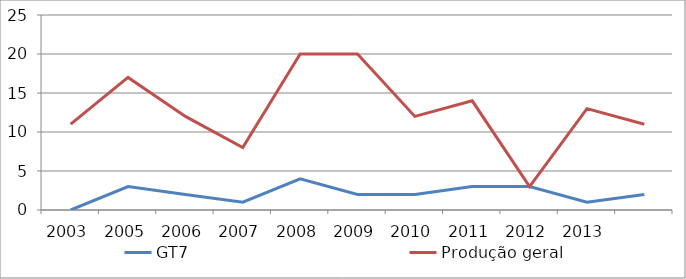
| Category | GT7 | Produção geral |
|---|---|---|
| 2003.0 | 0 | 11 |
| 2005.0 | 3 | 17 |
| 2006.0 | 2 | 12 |
| 2007.0 | 1 | 8 |
| 2008.0 | 4 | 20 |
| 2009.0 | 2 | 20 |
| 2010.0 | 2 | 12 |
| 2011.0 | 3 | 14 |
| 2012.0 | 3 | 3 |
| 2013.0 | 1 | 13 |